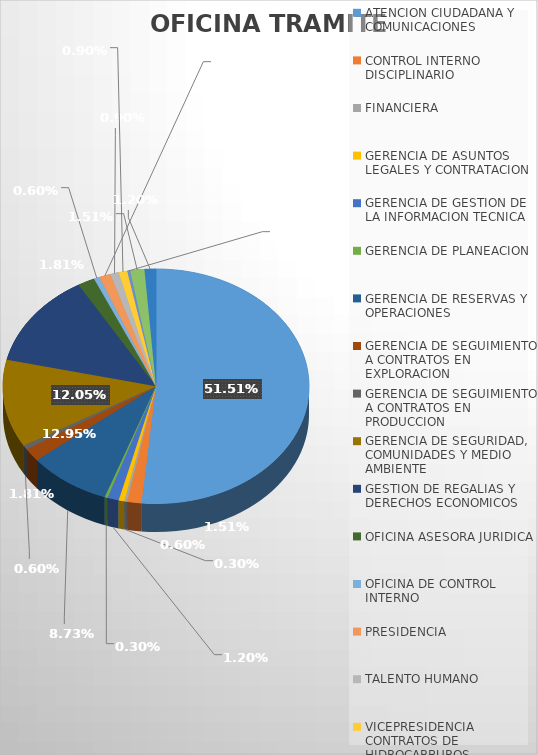
| Category | CANTIDAD |
|---|---|
| ATENCION CIUDADANA Y COMUNICACIONES | 171 |
| CONTROL INTERNO DISCIPLINARIO | 5 |
| FINANCIERA | 1 |
| GERENCIA DE ASUNTOS LEGALES Y CONTRATACION | 2 |
| GERENCIA DE GESTION DE LA INFORMACION TECNICA | 4 |
| GERENCIA DE PLANEACION | 1 |
| GERENCIA DE RESERVAS Y OPERACIONES | 29 |
| GERENCIA DE SEGUIMIENTO A CONTRATOS EN EXPLORACION | 6 |
| GERENCIA DE SEGUIMIENTO A CONTRATOS EN PRODUCCION | 2 |
| GERENCIA DE SEGURIDAD, COMUNIDADES Y MEDIO AMBIENTE | 40 |
| GESTION DE REGALIAS Y DERECHOS ECONOMICOS | 43 |
| OFICINA ASESORA JURIDICA | 6 |
| OFICINA DE CONTROL INTERNO | 2 |
| PRESIDENCIA | 4 |
| TALENTO HUMANO | 3 |
| VICEPRESIDENCIA CONTRATOS DE HIDROCARBUROS | 3 |
| VICEPRESIDENCIA DE OPERACIONES, REGALIAS Y PARTICIPACIONES | 1 |
| VICEPRESIDENCIA PROMOCION Y ASIGNACION DE AREAS | 5 |
| VICEPRESIDENCIA TECNICA | 4 |